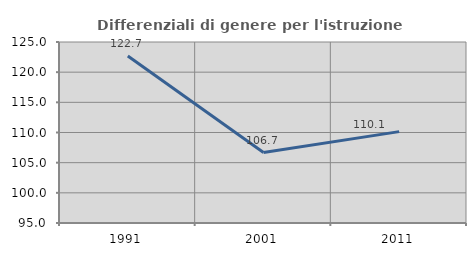
| Category | Differenziali di genere per l'istruzione superiore |
|---|---|
| 1991.0 | 122.669 |
| 2001.0 | 106.675 |
| 2011.0 | 110.145 |